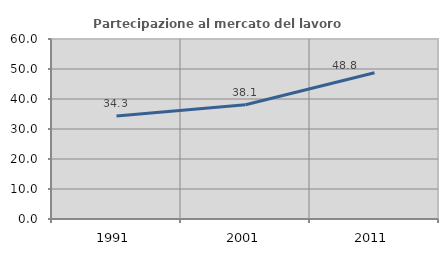
| Category | Partecipazione al mercato del lavoro  femminile |
|---|---|
| 1991.0 | 34.294 |
| 2001.0 | 38.07 |
| 2011.0 | 48.756 |